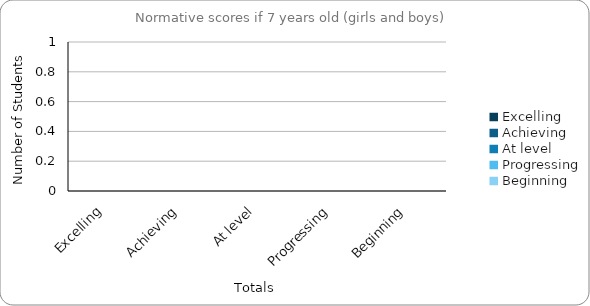
| Category | If 7 years old |
|---|---|
| Excelling | 0 |
| Achieving | 0 |
| At level | 0 |
| Progressing | 0 |
| Beginning | 0 |